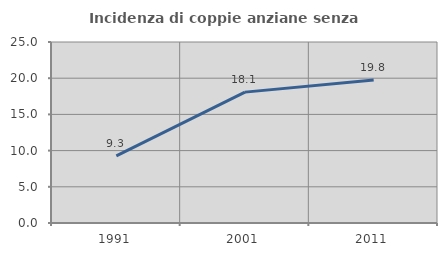
| Category | Incidenza di coppie anziane senza figli  |
|---|---|
| 1991.0 | 9.283 |
| 2001.0 | 18.077 |
| 2011.0 | 19.767 |